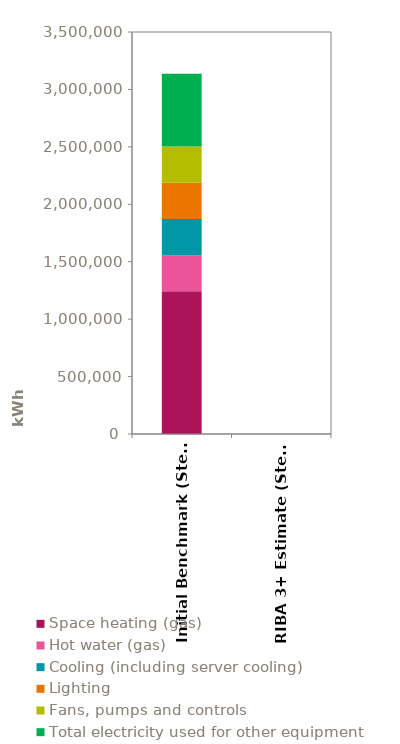
| Category | Space heating (gas) | Hot water (gas) | Cooling (including server cooling) | Lighting | Fans, pumps and controls | Total electricity used for other equipment |
|---|---|---|---|---|---|---|
| Initial Benchmark (Step 1) | 1243832 | 310958 | 316145.25 | 316145.25 | 316145.25 | 632290.5 |
| RIBA 3+ Estimate (Step 2) | 0 | 0 | 0 | 0 | 0 | 0 |